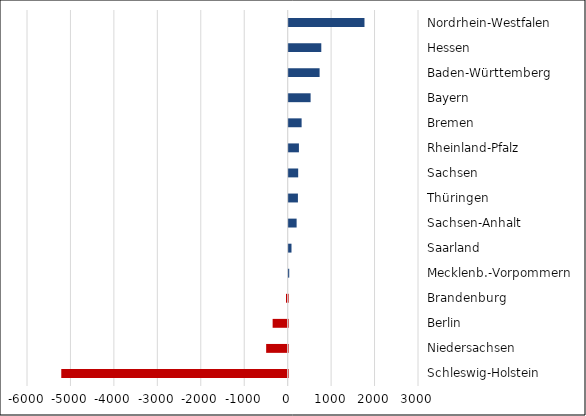
| Category | Series 0 |
|---|---|
| Schleswig-Holstein | -5211 |
| Niedersachsen | -495 |
| Berlin | -346 |
| Brandenburg | -38 |
| Mecklenb.-Vorpommern | 13 |
| Saarland | 65 |
| Sachsen-Anhalt | 183 |
| Thüringen | 213 |
| Sachsen | 219 |
| Rheinland-Pfalz | 236 |
| Bremen | 298 |
| Bayern | 505 |
| Baden-Württemberg | 712 |
| Hessen | 751 |
| Nordrhein-Westfalen | 1745 |